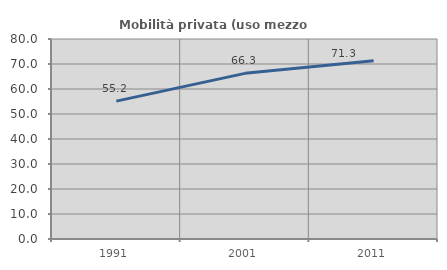
| Category | Mobilità privata (uso mezzo privato) |
|---|---|
| 1991.0 | 55.163 |
| 2001.0 | 66.258 |
| 2011.0 | 71.293 |